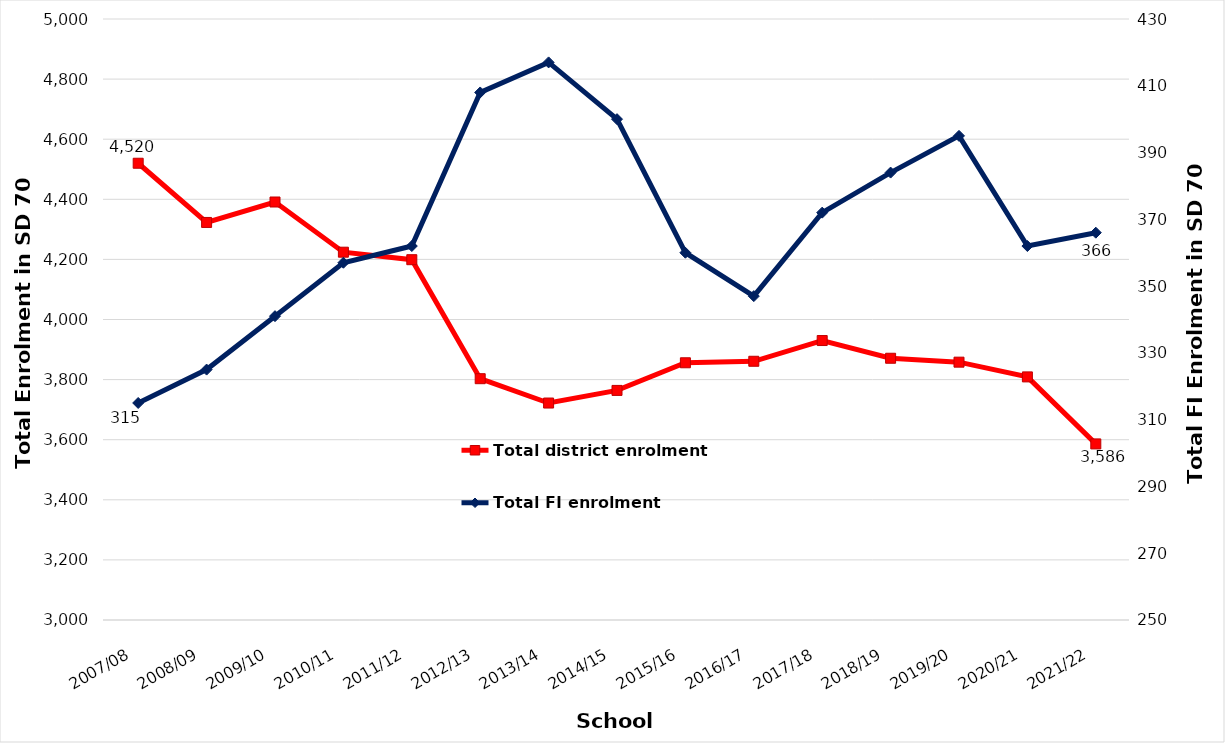
| Category | Total district enrolment  |
|---|---|
| 2007/08 | 4520 |
| 2008/09 | 4323 |
| 2009/10 | 4391 |
| 2010/11 | 4224 |
| 2011/12 | 4199 |
| 2012/13 | 3803 |
| 2013/14 | 3722 |
| 2014/15 | 3764 |
| 2015/16 | 3856 |
| 2016/17 | 3861 |
| 2017/18 | 3930 |
| 2018/19 | 3871 |
| 2019/20 | 3858 |
| 2020/21 | 3809 |
| 2021/22 | 3586 |